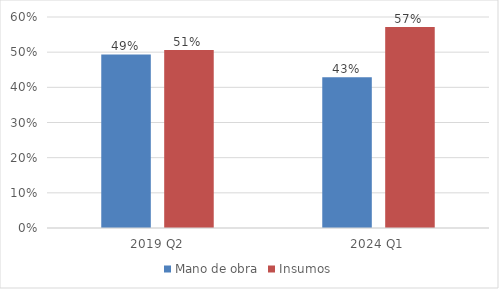
| Category | Mano de obra | Insumos |
|---|---|---|
| 2019 Q2 | 0.494 | 0.506 |
| 2024 Q1 | 0.429 | 0.571 |